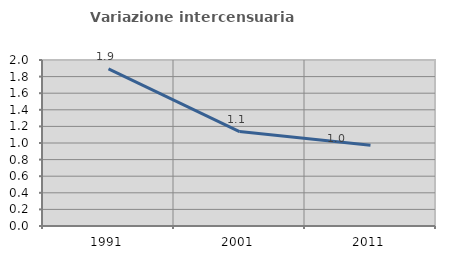
| Category | Variazione intercensuaria annua |
|---|---|
| 1991.0 | 1.892 |
| 2001.0 | 1.137 |
| 2011.0 | 0.972 |